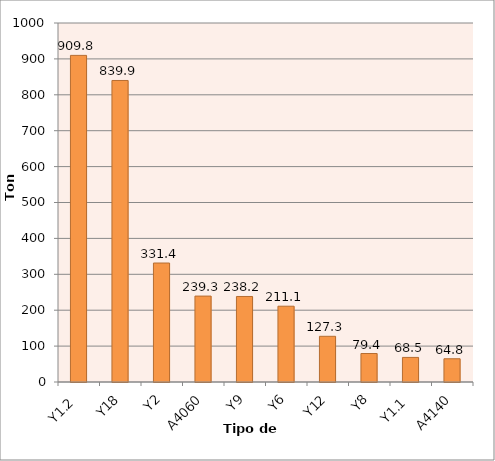
| Category | Series 0 |
|---|---|
| Y1.2 | 909.784 |
| Y18 | 839.886 |
| Y2 | 331.411 |
| A4060 | 239.322 |
| Y9 | 238.234 |
| Y6 | 211.129 |
| Y12 | 127.293 |
| Y8 | 79.374 |
| Y1.1 | 68.503 |
| A4140 | 64.762 |